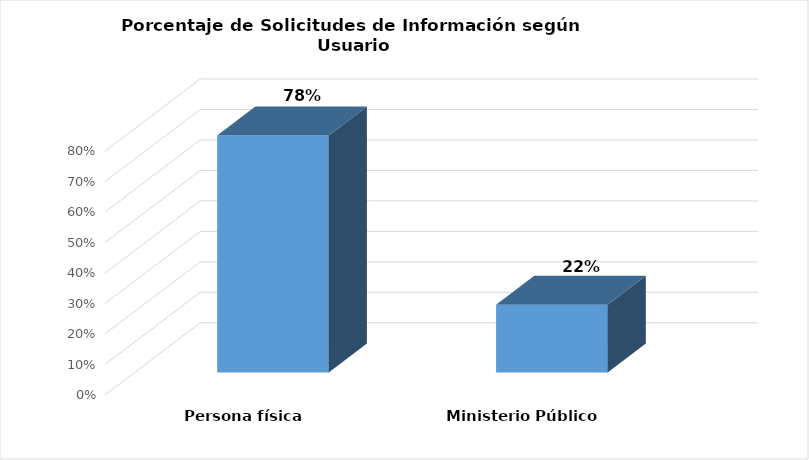
| Category | Series 0 |
|---|---|
| Persona física | 0.778 |
| Ministerio Público | 0.222 |